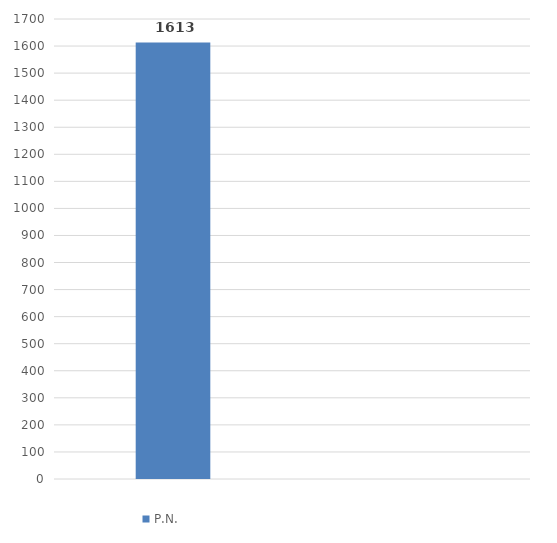
| Category | P.N. | INACIF |
|---|---|---|
| INACIF | 1613 |  |